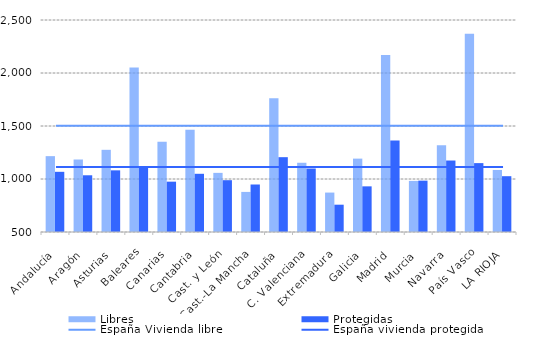
| Category | Libres | Protegidas |
|---|---|---|
| Andalucía | 1215.625 | 1067.775 |
| Aragón | 1184.075 | 1035.125 |
| Asturias | 1275.35 | 1081.6 |
| Baleares | 2051.7 | 1115.075 |
| Canarias | 1352.55 | 974.825 |
| Cantabria | 1465.525 | 1049.175 |
| Cast. y León | 1057.925 | 988.775 |
| Cast.-La Mancha | 878.2 | 948.125 |
| Cataluña | 1762.95 | 1205.85 |
| C. Valenciana | 1153.175 | 1098.875 |
| Extremadura | 871.975 | 757.625 |
| Galicia | 1192.35 | 930.675 |
| Madrid | 2169.125 | 1363.45 |
| Murcia | 981.95 | 984.475 |
| Navarra | 1318.2 | 1174.35 |
| País Vasco | 2369.4 | 1149.8 |
| LA RIOJA | 1085.25 | 1026.5 |